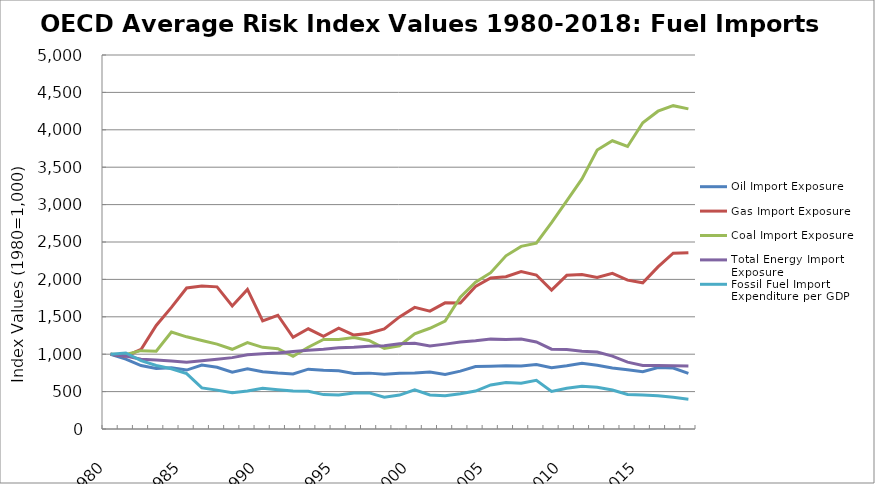
| Category | Oil Import Exposure | Gas Import Exposure | Coal Import Exposure | Total Energy Import Exposure | Fossil Fuel Import Expenditure per GDP |
|---|---|---|---|---|---|
| 1980.0 | 1000 | 1000 | 1000 | 1000 | 1000 |
| 1981.0 | 934.821 | 974.548 | 995.942 | 975.105 | 1016.961 |
| 1982.0 | 847.981 | 1063.37 | 1047.639 | 932.966 | 913.432 |
| 1983.0 | 809.996 | 1384.691 | 1039.441 | 923.422 | 849.492 |
| 1984.0 | 819.2 | 1625.792 | 1296.774 | 908.279 | 805.524 |
| 1985.0 | 787.743 | 1884.661 | 1232.536 | 891.079 | 739.577 |
| 1986.0 | 854.851 | 1912.62 | 1183.283 | 912.634 | 549.296 |
| 1987.0 | 826.22 | 1900.286 | 1134.767 | 932.55 | 519.954 |
| 1988.0 | 760.213 | 1644.487 | 1065.594 | 954.081 | 485.861 |
| 1989.0 | 804.936 | 1866.765 | 1154.759 | 993.715 | 509.192 |
| 1990.0 | 764.391 | 1445.615 | 1091.782 | 1004.655 | 544.745 |
| 1991.0 | 747.537 | 1520.699 | 1074.282 | 1015.876 | 526.187 |
| 1992.0 | 736.254 | 1226.313 | 971.105 | 1034.569 | 508.774 |
| 1993.0 | 799.992 | 1339.428 | 1092.992 | 1051.323 | 504.568 |
| 1994.0 | 785.346 | 1239.63 | 1196.561 | 1065.47 | 459.9 |
| 1995.0 | 779.358 | 1347.945 | 1197.748 | 1086.394 | 453.536 |
| 1996.0 | 742.368 | 1255.202 | 1221.924 | 1091.746 | 481.843 |
| 1997.0 | 746.952 | 1281.158 | 1183.352 | 1105.631 | 482.91 |
| 1998.0 | 731.915 | 1336.816 | 1077.393 | 1112.969 | 426.066 |
| 1999.0 | 743.954 | 1498.693 | 1112.913 | 1141.144 | 453.409 |
| 2000.0 | 747.967 | 1625.986 | 1273.771 | 1145.353 | 523.448 |
| 2001.0 | 762.078 | 1576.146 | 1346.65 | 1110.269 | 455.144 |
| 2002.0 | 730.213 | 1686.683 | 1442.057 | 1134.623 | 445.625 |
| 2003.0 | 773.742 | 1685.776 | 1763.339 | 1161.741 | 472.337 |
| 2004.0 | 834.156 | 1904.922 | 1961.409 | 1179.307 | 507.163 |
| 2005.0 | 837.714 | 2018.204 | 2089.683 | 1201.534 | 588.937 |
| 2006.0 | 844.308 | 2035.772 | 2315.263 | 1198.109 | 622.64 |
| 2007.0 | 841.659 | 2105.723 | 2441.093 | 1204.354 | 613.034 |
| 2008.0 | 863.385 | 2058.031 | 2484.775 | 1164.198 | 651.558 |
| 2009.0 | 819.342 | 1856.348 | 2759.716 | 1067.119 | 501.417 |
| 2010.0 | 844.663 | 2054.523 | 3049.269 | 1064.038 | 544.618 |
| 2011.0 | 880.212 | 2065.031 | 3342.895 | 1040.498 | 570.368 |
| 2012.0 | 852.036 | 2024.526 | 3730.132 | 1029.713 | 558.749 |
| 2013.0 | 815.582 | 2080.625 | 3853.512 | 974.62 | 521.181 |
| 2014.0 | 790.841 | 1989.811 | 3777.474 | 894.161 | 460.523 |
| 2015.0 | 764.903 | 1954.33 | 4094.182 | 850.418 | 455.076 |
| 2016.0 | 822.457 | 2167.721 | 4248.785 | 850.356 | 444.056 |
| 2017.0 | 815.532 | 2350.106 | 4322.672 | 846.948 | 422.921 |
| 2018.0 | 744.433 | 2357.91 | 4280.162 | 842.687 | 398.96 |